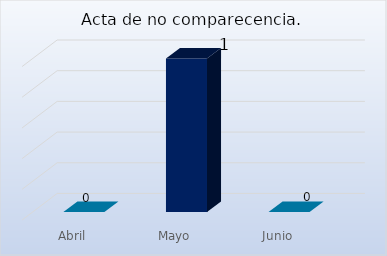
| Category | Acta de no comparecencia. |
|---|---|
| Abril | 0 |
| Mayo | 1 |
| Junio | 0 |